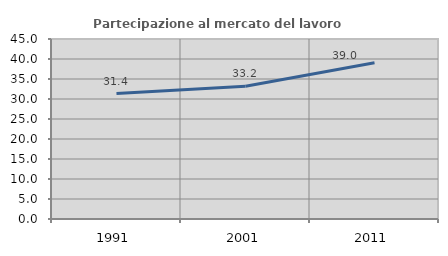
| Category | Partecipazione al mercato del lavoro  femminile |
|---|---|
| 1991.0 | 31.361 |
| 2001.0 | 33.17 |
| 2011.0 | 39.046 |